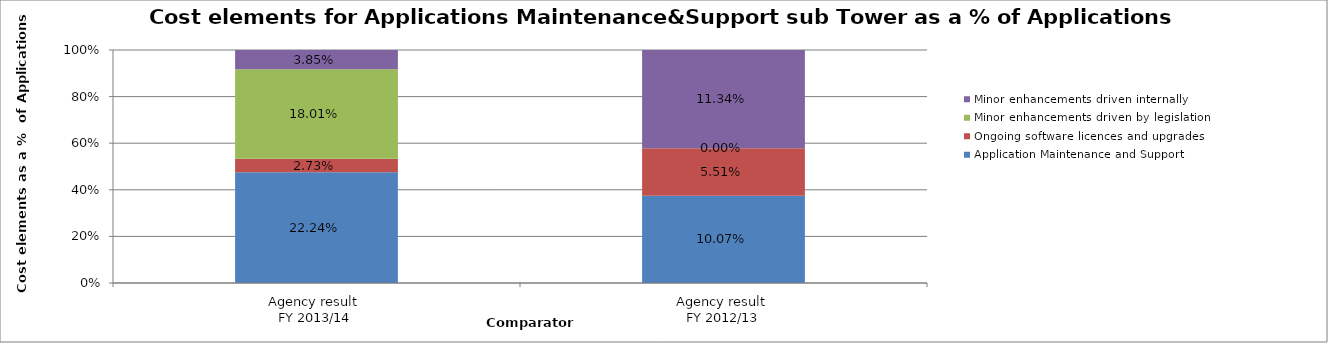
| Category | Application Maintenance and Support | Ongoing software licences and upgrades | Minor enhancements driven by legislation | Minor enhancements driven internally |
|---|---|---|---|---|
| Agency result 
FY 2013/14 | 0.222 | 0.027 | 0.18 | 0.038 |
| Agency result 
FY 2012/13 | 0.101 | 0.055 | 0 | 0.113 |